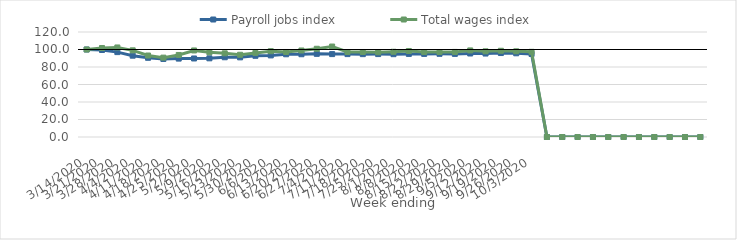
| Category | Payroll jobs index | Total wages index |
|---|---|---|
| 14/03/2020 | 100 | 100 |
| 21/03/2020 | 99.456 | 101.725 |
| 28/03/2020 | 97.012 | 102.335 |
| 04/04/2020 | 92.936 | 99.042 |
| 11/04/2020 | 90.517 | 93.138 |
| 18/04/2020 | 89.19 | 90.713 |
| 25/04/2020 | 89.594 | 93.764 |
| 02/05/2020 | 89.735 | 98.908 |
| 09/05/2020 | 89.924 | 96.813 |
| 16/05/2020 | 91.143 | 95.635 |
| 23/05/2020 | 91.032 | 93.982 |
| 30/05/2020 | 92.798 | 96.091 |
| 06/06/2020 | 93.242 | 98.058 |
| 13/06/2020 | 94.541 | 97.155 |
| 20/06/2020 | 94.573 | 98.869 |
| 27/06/2020 | 95.035 | 100.822 |
| 04/07/2020 | 94.744 | 103.378 |
| 11/07/2020 | 94.747 | 97.132 |
| 18/07/2020 | 94.694 | 97.158 |
| 25/07/2020 | 94.763 | 96.806 |
| 01/08/2020 | 94.654 | 97.409 |
| 08/08/2020 | 94.949 | 98.29 |
| 15/08/2020 | 94.951 | 97.09 |
| 22/08/2020 | 95.069 | 97.131 |
| 29/08/2020 | 94.975 | 97.229 |
| 05/09/2020 | 95.444 | 98.941 |
| 12/09/2020 | 95.381 | 97.928 |
| 19/09/2020 | 95.949 | 98.551 |
| 26/09/2020 | 95.67 | 97.936 |
| 03/10/2020 | 94.905 | 97.34 |